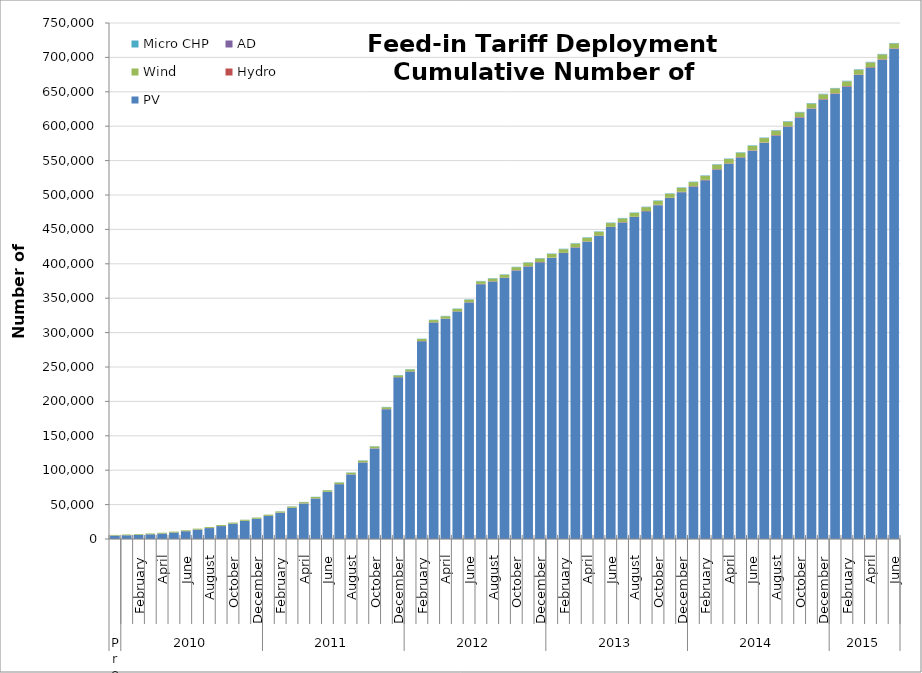
| Category | PV | Hydro | Wind | AD | Micro CHP |
|---|---|---|---|---|---|
| 0 | 4840 | 153 | 969 | 2 | 0 |
| 1 | 5374 | 154 | 992 | 2 | 0 |
| 2 | 5845 | 167 | 1027 | 2 | 0 |
| 3 | 6780 | 190 | 1082 | 3 | 0 |
| 4 | 7830 | 191 | 1119 | 3 | 0 |
| 5 | 9349 | 191 | 1169 | 3 | 0 |
| 6 | 11262 | 192 | 1222 | 4 | 6 |
| 7 | 13580 | 195 | 1279 | 5 | 16 |
| 8 | 15858 | 196 | 1333 | 6 | 25 |
| 9 | 18721 | 200 | 1390 | 6 | 38 |
| 10 | 22197 | 209 | 1472 | 6 | 56 |
| 11 | 26206 | 213 | 1551 | 6 | 92 |
| 12 | 29288 | 214 | 1594 | 6 | 125 |
| 13 | 33435 | 221 | 1649 | 7 | 152 |
| 14 | 38114 | 222 | 1706 | 7 | 196 |
| 15 | 45181 | 226 | 1797 | 9 | 241 |
| 16 | 51516 | 236 | 1868 | 10 | 266 |
| 17 | 58844 | 249 | 1957 | 12 | 293 |
| 18 | 68375 | 254 | 2160 | 13 | 312 |
| 19 | 79636 | 258 | 2222 | 13 | 332 |
| 20 | 93793 | 265 | 2290 | 15 | 357 |
| 21 | 111222 | 279 | 2384 | 15 | 399 |
| 22 | 131693 | 287 | 2458 | 16 | 428 |
| 23 | 188717 | 296 | 2535 | 17 | 444 |
| 24 | 234925 | 304 | 2614 | 20 | 456 |
| 25 | 243393 | 313 | 2745 | 22 | 461 |
| 26 | 287408 | 332 | 2902 | 22 | 466 |
| 27 | 314511 | 349 | 3339 | 22 | 476 |
| 28 | 320033 | 357 | 3411 | 24 | 484 |
| 29 | 330558 | 369 | 3527 | 28 | 496 |
| 30 | 343824 | 382 | 3671 | 31 | 513 |
| 31 | 370387 | 392 | 3797 | 36 | 519 |
| 32 | 374302 | 392 | 3961 | 37 | 522 |
| 33 | 379568 | 403 | 4165 | 41 | 532 |
| 34 | 390290 | 413 | 4400 | 44 | 547 |
| 35 | 396078 | 425 | 5155 | 45 | 561 |
| 36 | 402140 | 441 | 5173 | 48 | 569 |
| 37 | 408582 | 442 | 5208 | 50 | 580 |
| 38 | 415533 | 450 | 5273 | 52 | 584 |
| 39 | 423619 | 455 | 5318 | 53 | 587 |
| 40 | 432049 | 462 | 5341 | 55 | 592 |
| 41 | 440595 | 474 | 5381 | 55 | 592 |
| 42 | 453314 | 477 | 5420 | 60 | 593 |
| 43 | 460074 | 481 | 5456 | 63 | 594 |
| 44 | 467928 | 485 | 5490 | 67 | 594 |
| 45 | 476284 | 495 | 5564 | 70 | 594 |
| 46 | 485266 | 503 | 5622 | 73 | 596 |
| 47 | 495513 | 524 | 5691 | 78 | 600 |
| 48 | 504121 | 534 | 5757 | 84 | 603 |
| 49 | 512375 | 542 | 5807 | 85 | 608 |
| 50 | 521393 | 550 | 5890 | 89 | 610 |
| 51 | 537133 | 564 | 6340 | 96 | 615 |
| 52 | 545347 | 567 | 6360 | 97 | 615 |
| 53 | 554380 | 575 | 6390 | 99 | 615 |
| 54 | 564482 | 579 | 6428 | 103 | 615 |
| 55 | 575704 | 587 | 6461 | 105 | 617 |
| 56 | 586448 | 598 | 6498 | 114 | 619 |
| 57 | 599348 | 609 | 6601 | 122 | 621 |
| 58 | 612766 | 623 | 6648 | 128 | 625 |
| 59 | 625502 | 637 | 6709 | 147 | 628 |
| 60 | 638843 | 645 | 6831 | 170 | 629 |
| 61 | 647330 | 655 | 6832 | 170 | 636 |
| 62 | 657723 | 660 | 6845 | 170 | 643 |
| 63 | 674305 | 661 | 6918 | 171 | 644 |
| 64 | 685177 | 661 | 6919 | 171 | 646 |
| 65 | 696683 | 661 | 6920 | 171 | 646 |
| 66 | 712594 | 661 | 6921 | 171 | 646 |